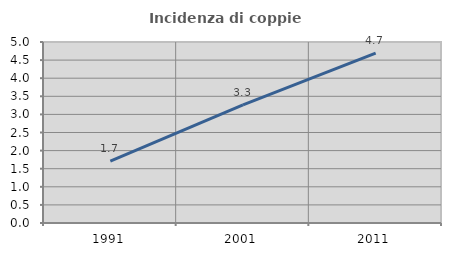
| Category | Incidenza di coppie miste |
|---|---|
| 1991.0 | 1.711 |
| 2001.0 | 3.262 |
| 2011.0 | 4.694 |